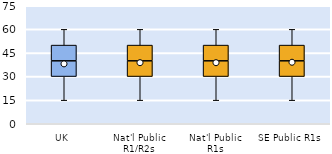
| Category | 25th | 50th | 75th |
|---|---|---|---|
| UK | 30 | 10 | 10 |
| Nat'l Public R1/R2s | 30 | 10 | 10 |
| Nat'l Public R1s | 30 | 10 | 10 |
| SE Public R1s | 30 | 10 | 10 |